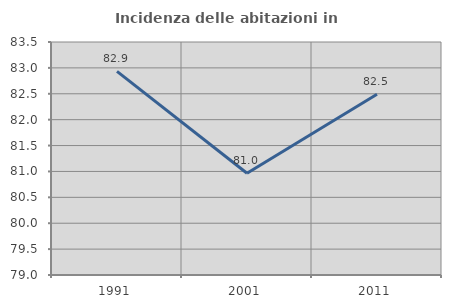
| Category | Incidenza delle abitazioni in proprietà  |
|---|---|
| 1991.0 | 82.933 |
| 2001.0 | 80.966 |
| 2011.0 | 82.493 |